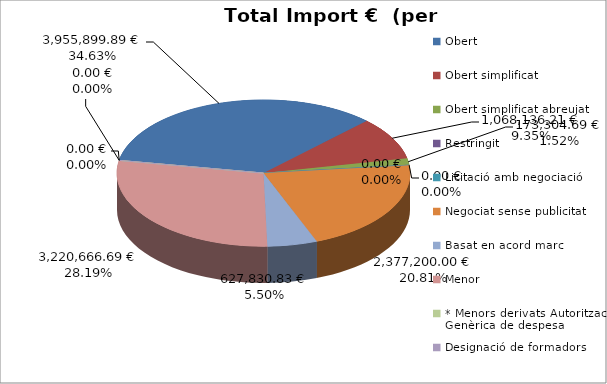
| Category | Total preu              (amb iva) |
|---|---|
| Obert | 3955899.89 |
| Obert simplificat | 1068136.21 |
| Obert simplificat abreujat | 173304.69 |
| Restringit | 0 |
| Licitació amb negociació | 0 |
| Negociat sense publicitat | 2377200 |
| Basat en acord marc | 627830.83 |
| Menor | 3220666.69 |
| * Menors derivats Autorització Genèrica de despesa | 0 |
| Designació de formadors | 0 |